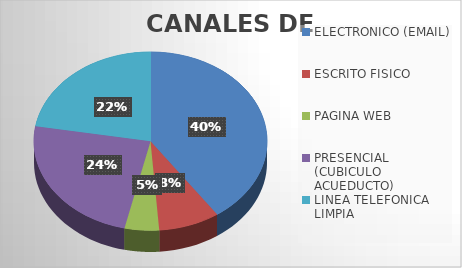
| Category | Series 0 |
|---|---|
| ELECTRONICO (EMAIL) | 338 |
| ESCRITO FISICO  | 71 |
| PAGINA WEB                               | 40 |
| PRESENCIAL                    (CUBICULO ACUEDUCTO) | 202 |
| LINEA TELEFONICA LIMPIA | 187 |